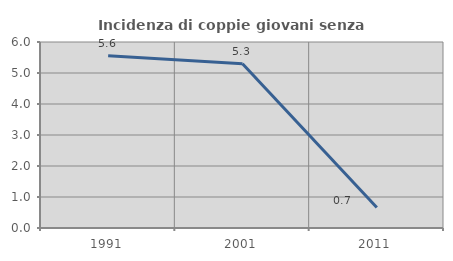
| Category | Incidenza di coppie giovani senza figli |
|---|---|
| 1991.0 | 5.556 |
| 2001.0 | 5.298 |
| 2011.0 | 0.662 |